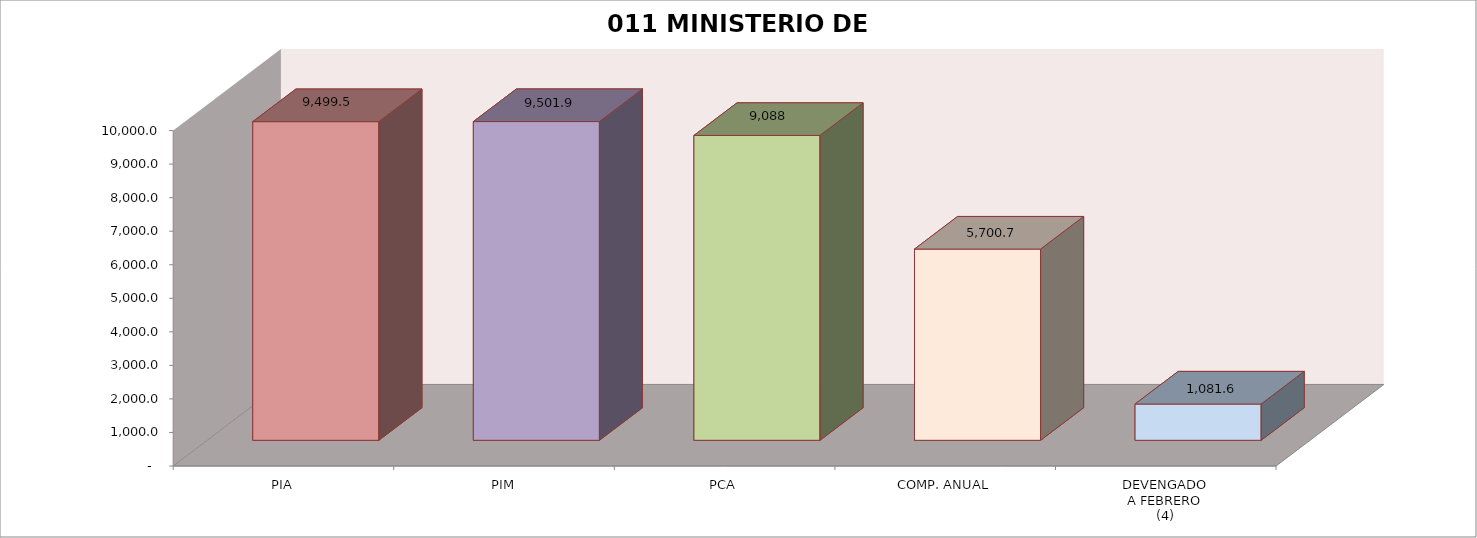
| Category | 011 MINISTERIO DE SALUD |
|---|---|
| PIA | 9499.522 |
| PIM | 9501.912 |
| PCA | 9088.168 |
| COMP. ANUAL | 5700.725 |
| DEVENGADO
A FEBRERO
(4) | 1081.643 |